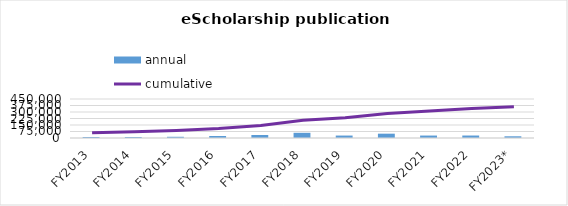
| Category | annual |
|---|---|
| FY2013 | 11300 |
| FY2014 | 11522 |
| FY2015 | 14055 |
| FY2016 | 23166 |
| FY2017 | 34857 |
| FY2018 | 59940 |
| FY2019 | 28225 |
| FY2020 | 49866 |
| FY2021 | 28319 |
| FY2022 | 28585 |
| FY2023* | 19759 |